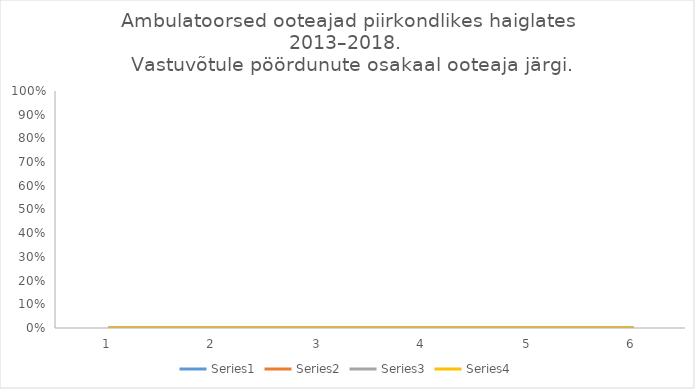
| Category | Series 0 | Series 1 | Series 2 | Series 3 |
|---|---|---|---|---|
| 0 | 0.184 | 0.144 | 0.286 | 0.386 |
| 1 | 0.178 | 0.145 | 0.288 | 0.388 |
| 2 | 0.175 | 0.143 | 0.285 | 0.398 |
| 3 | 0.17 | 0.14 | 0.26 | 0.43 |
| 4 | 0.16 | 0.15 | 0.28 | 0.41 |
| 5 | 0.13 | 0.15 | 0.27 | 0.46 |